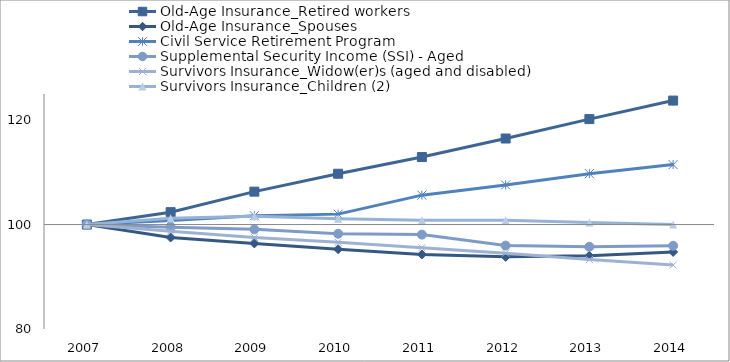
| Category | Old-Age Insurance_Retired workers | Old-Age Insurance_Spouses | Civil Service Retirement Program | Supplemental Security Income (SSI) - Aged | Survivors Insurance_Widow(er)s (aged and disabled) | Survivors Insurance_Children (2) |
|---|---|---|---|---|---|---|
| 2007.0 | 100 | 100 | 100 | 100 | 100 | 100 |
| 2008.0 | 102.373 | 97.513 | 100.776 | 99.504 | 98.734 | 101.206 |
| 2009.0 | 106.303 | 96.389 | 101.694 | 99.082 | 97.535 | 101.588 |
| 2010.0 | 109.729 | 95.275 | 101.997 | 98.241 | 96.593 | 101.112 |
| 2011.0 | 112.923 | 94.268 | 105.633 | 98.072 | 95.554 | 100.823 |
| 2012.0 | 116.476 | 93.811 | 107.582 | 95.972 | 94.525 | 100.811 |
| 2013.0 | 120.193 | 94.014 | 109.748 | 95.743 | 93.296 | 100.378 |
| 2014.0 | 123.739 | 94.764 | 111.48 | 95.933 | 92.247 | 100.018 |